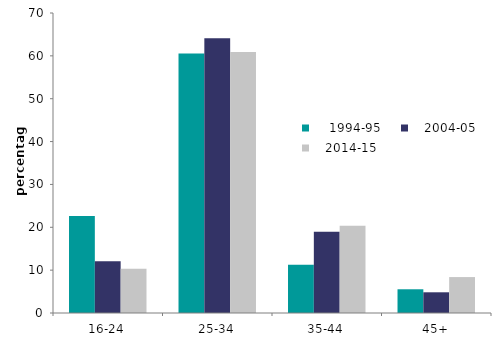
| Category |     1994-95 |    2004-05 |    2014-15 |
|---|---|---|---|
| 16-24 | 22.629 | 12.08 | 10.341 |
| 25-34 | 60.551 | 64.116 | 60.888 |
| 35-44 | 11.284 | 18.972 | 20.386 |
| 45+ | 5.535 | 4.831 | 8.385 |